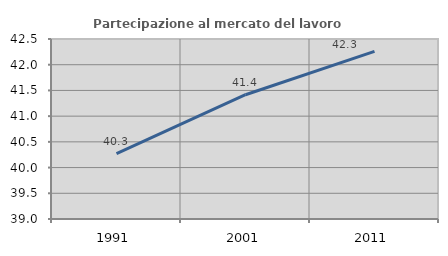
| Category | Partecipazione al mercato del lavoro  femminile |
|---|---|
| 1991.0 | 40.272 |
| 2001.0 | 41.416 |
| 2011.0 | 42.259 |